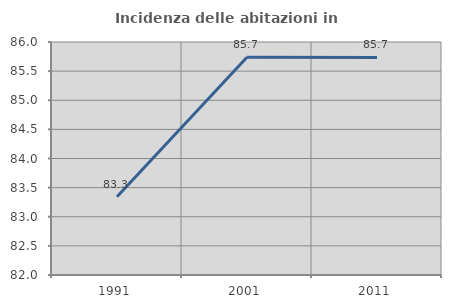
| Category | Incidenza delle abitazioni in proprietà  |
|---|---|
| 1991.0 | 83.342 |
| 2001.0 | 85.739 |
| 2011.0 | 85.735 |